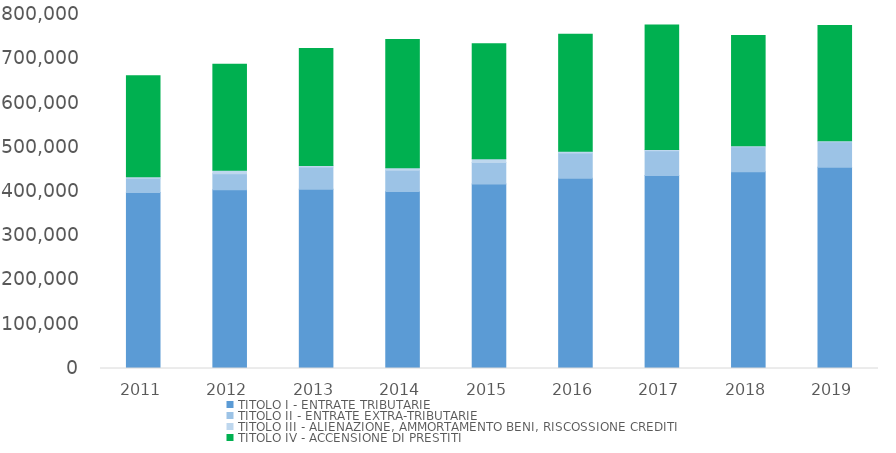
| Category | TITOLO I - ENTRATE TRIBUTARIE | TITOLO II - ENTRATE EXTRA-TRIBUTARIE | TITOLO III - ALIENAZIONE, AMMORTAMENTO BENI, RISCOSSIONE CREDITI | TITOLO IV - ACCENSIONE DI PRESTITI |
|---|---|---|---|---|
| 2011.0 | 397920.866 | 32084.896 | 3235.46 | 228422.129 |
| 2012.0 | 404223.451 | 35956.159 | 7888.953 | 239783.649 |
| 2013.0 | 405343.119 | 49819.799 | 3353.962 | 264846.999 |
| 2014.0 | 399719.603 | 48477.677 | 5424.732 | 289972.991 |
| 2015.0 | 416797.058 | 48665.553 | 8750.796 | 259542.417 |
| 2016.0 | 430133.794 | 56790.651 | 3756.401 | 264618.209 |
| 2017.0 | 436128.673 | 56159.986 | 2422.837 | 281609.658 |
| 2018.0 | 444572.682 | 56824.006 | 2115.122 | 249065.559 |
| 2019.0 | 454539.451 | 57878.49 | 2100.437 | 260408.77 |